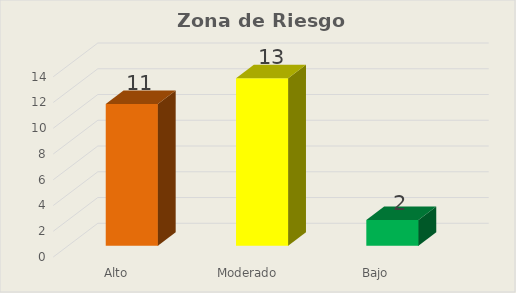
| Category | Series 0 |
|---|---|
| Alto | 11 |
| Moderado | 13 |
| Bajo  | 2 |